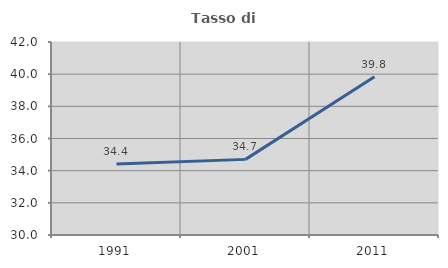
| Category | Tasso di occupazione   |
|---|---|
| 1991.0 | 34.412 |
| 2001.0 | 34.702 |
| 2011.0 | 39.846 |